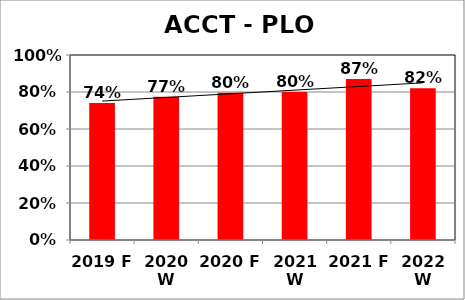
| Category | Series 0 |
|---|---|
| 2019 F | 0.74 |
| 2020 W | 0.775 |
| 2020 F | 0.796 |
| 2021 W | 0.8 |
| 2021 F | 0.87 |
| 2022 W | 0.82 |